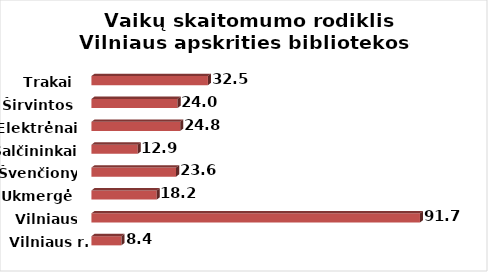
| Category | Series 0 |
|---|---|
| Vilniaus r. | 8.361 |
| Vilniaus m. | 91.663 |
| Ukmergė | 18.222 |
| Švenčionys | 23.603 |
| Šalčininkai | 12.92 |
| Elektrėnai | 24.771 |
| Širvintos | 24.012 |
| Trakai | 32.5 |